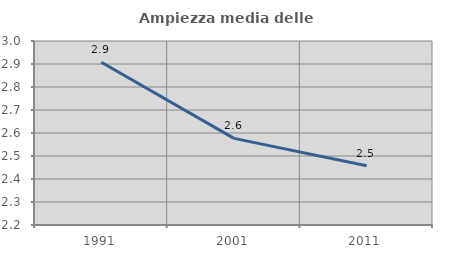
| Category | Ampiezza media delle famiglie |
|---|---|
| 1991.0 | 2.908 |
| 2001.0 | 2.577 |
| 2011.0 | 2.458 |